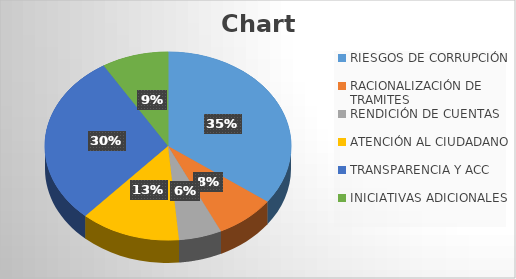
| Category | Series 0 |
|---|---|
| RIESGOS DE CORRUPCIÓN | 0.89 |
| RACIONALIZACIÓN DE TRAMITES | 0.2 |
| RENDICIÓN DE CUENTAS | 0.143 |
| ATENCIÓN AL CIUDADANO | 0.333 |
| TRANSPARENCIA Y ACC | 0.75 |
| INICIATIVAS ADICIONALES | 0.222 |